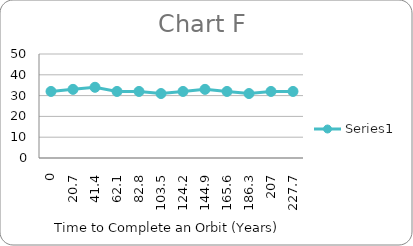
| Category | Series 0 |
|---|---|
| 0.0 | 32 |
| 20.7 | 33 |
| 41.4 | 34 |
| 62.099999999999994 | 32 |
| 82.8 | 32 |
| 103.5 | 31 |
| 124.19999999999999 | 32 |
| 144.9 | 33 |
| 165.6 | 32 |
| 186.29999999999998 | 31 |
| 207.0 | 32 |
| 227.7 | 32 |